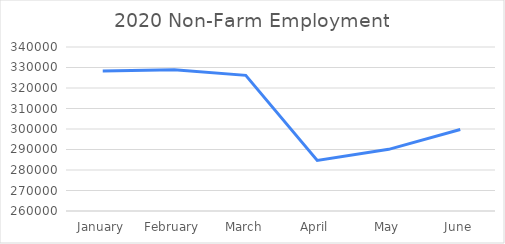
| Category | Series 0 |
|---|---|
| January | 328324 |
| February | 328844 |
| March | 326161 |
| April | 284652 |
| May | 290080 |
| June | 299735 |